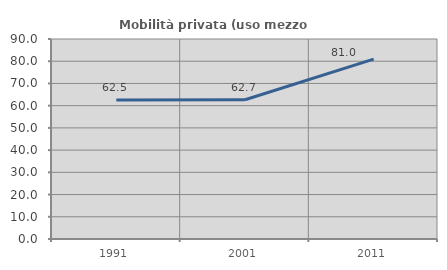
| Category | Mobilità privata (uso mezzo privato) |
|---|---|
| 1991.0 | 62.5 |
| 2001.0 | 62.651 |
| 2011.0 | 80.952 |